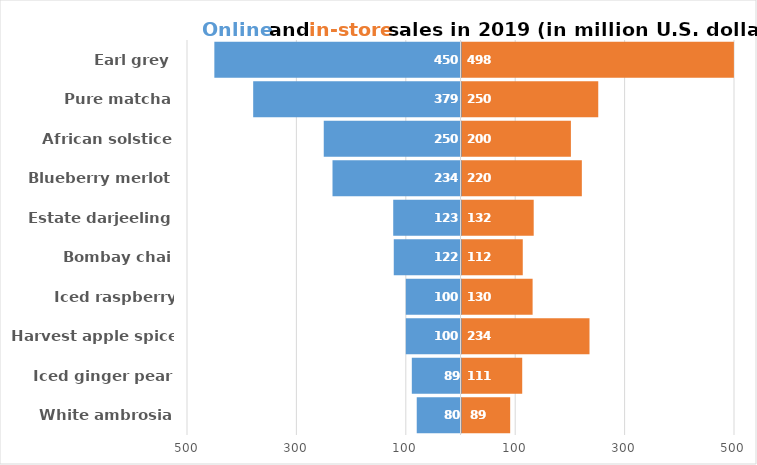
| Category | In-store |
|---|---|
| White ambrosia | 89 |
| Iced ginger pear | 111 |
| Harvest apple spice | 234 |
| Iced raspberry nectar | 130 |
| Bombay chai | 112 |
| Estate darjeeling | 132 |
| Blueberry merlot | 220 |
| African solstice | 200 |
| Pure matcha | 250 |
| Earl grey | 498 |